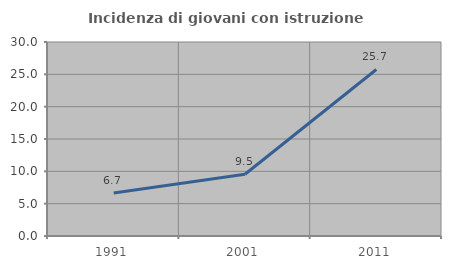
| Category | Incidenza di giovani con istruzione universitaria |
|---|---|
| 1991.0 | 6.656 |
| 2001.0 | 9.546 |
| 2011.0 | 25.75 |